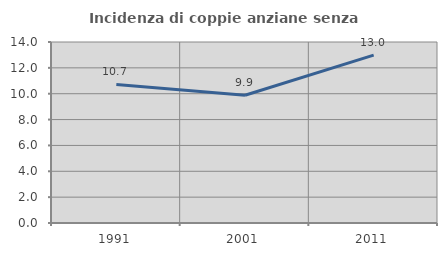
| Category | Incidenza di coppie anziane senza figli  |
|---|---|
| 1991.0 | 10.714 |
| 2001.0 | 9.881 |
| 2011.0 | 12.984 |